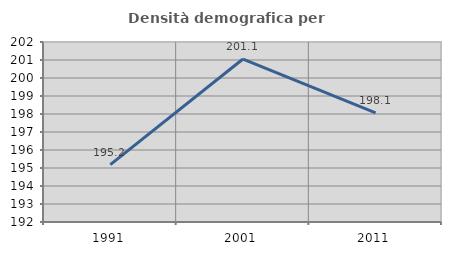
| Category | Densità demografica |
|---|---|
| 1991.0 | 195.185 |
| 2001.0 | 201.054 |
| 2011.0 | 198.062 |